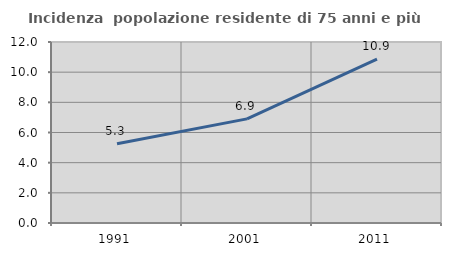
| Category | Incidenza  popolazione residente di 75 anni e più |
|---|---|
| 1991.0 | 5.253 |
| 2001.0 | 6.904 |
| 2011.0 | 10.871 |